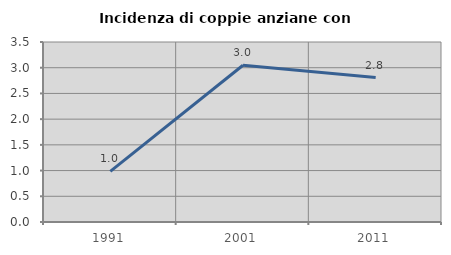
| Category | Incidenza di coppie anziane con figli |
|---|---|
| 1991.0 | 0.984 |
| 2001.0 | 3.047 |
| 2011.0 | 2.807 |